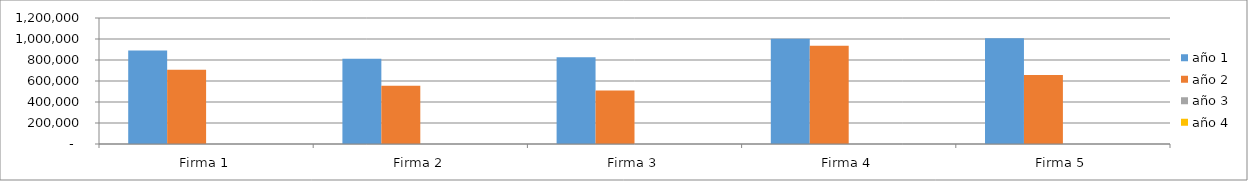
| Category | año 1 | año 2 | año 3 | año 4 |
|---|---|---|---|---|
| Firma 1 | 890450.022 | 707381.085 | 0 | 0 |
| Firma 2 | 812025.331 | 553745.113 | 0 | 0 |
| Firma 3 | 825124.008 | 509789.755 | 0 | 0 |
| Firma 4 | 1001719.655 | 935034.101 | 0 | 0 |
| Firma 5 | 1007894.408 | 656943.693 | 0 | 0 |